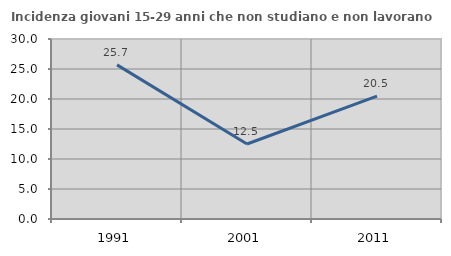
| Category | Incidenza giovani 15-29 anni che non studiano e non lavorano  |
|---|---|
| 1991.0 | 25.688 |
| 2001.0 | 12.5 |
| 2011.0 | 20.488 |